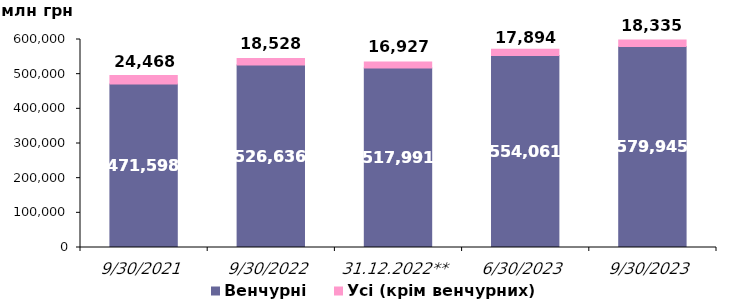
| Category | Венчурні | Усі (крім венчурних) |
|---|---|---|
| 30.09.2021 | 471598.282 | 24468.121 |
| 30.09.2022 | 526635.614 | 18527.657 |
| 31.12.2022** | 517991.01 | 16927.416 |
| 30.06.2023 | 554061.369 | 17893.869 |
| 30.09.2023 | 579945.34 | 18334.898 |